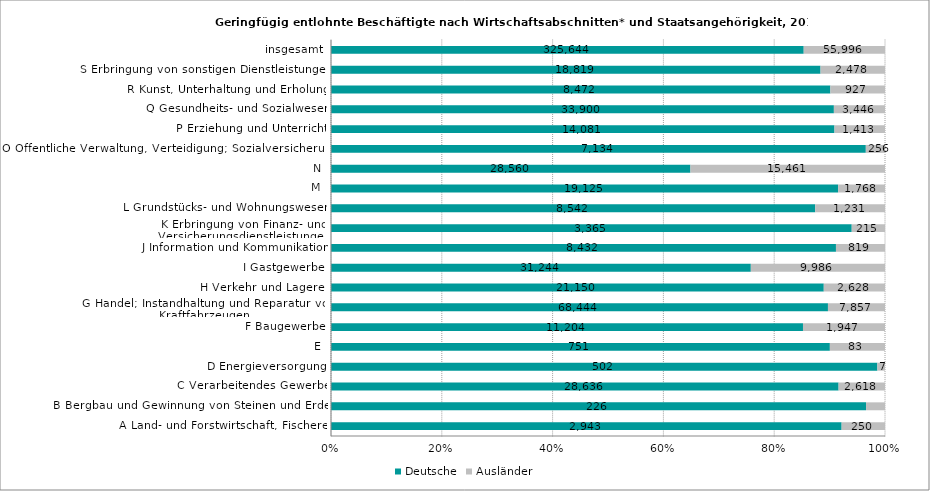
| Category | Deutsche | Ausländer |
|---|---|---|
| A Land- und Forstwirtschaft, Fischerei | 2943 | 250 |
| B Bergbau und Gewinnung von Steinen und Erden | 226 | 8 |
| C Verarbeitendes Gewerbe | 28636 | 2618 |
| D Energieversorgung | 502 | 7 |
| E | 751 | 83 |
| F Baugewerbe | 11204 | 1947 |
| G Handel; Instandhaltung und Reparatur von Kraftfahrzeugen | 68444 | 7857 |
| H Verkehr und Lagerei | 21150 | 2628 |
| I Gastgewerbe | 31244 | 9986 |
| J Information und Kommunikation | 8432 | 819 |
| K Erbringung von Finanz- und Versicherungsdienstleistungen | 3365 | 215 |
| L Grundstücks- und Wohnungswesen | 8542 | 1231 |
| M | 19125 | 1768 |
| N | 28560 | 15461 |
| O Öffentliche Verwaltung, Verteidigung; Sozialversicherung | 7134 | 256 |
| P Erziehung und Unterricht | 14081 | 1413 |
| Q Gesundheits- und Sozialwesen | 33900 | 3446 |
| R Kunst, Unterhaltung und Erholung | 8472 | 927 |
| S Erbringung von sonstigen Dienstleistungen | 18819 | 2478 |
| insgesamt | 325644 | 55996 |